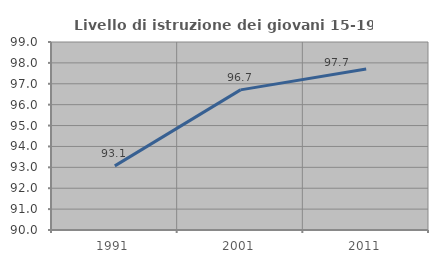
| Category | Livello di istruzione dei giovani 15-19 anni |
|---|---|
| 1991.0 | 93.069 |
| 2001.0 | 96.708 |
| 2011.0 | 97.706 |